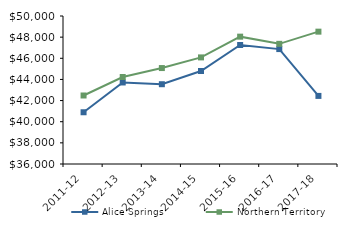
| Category | Alice Springs | Northern Territory |
|---|---|---|
| 2011-12 | 40894.47 | 42481 |
| 2012-13 | 43712.5 | 44232.02 |
| 2013-14 | 43546.97 | 45075.51 |
| 2014-15 | 44797.32 | 46083.65 |
| 2015-16 | 47256 | 48046.27 |
| 2016-17 | 46871 | 47367.05 |
| 2017-18 | 42441.04 | 48519 |